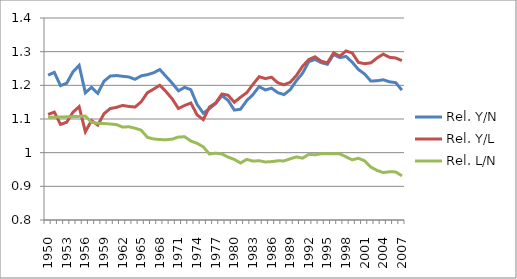
| Category | Rel. Y/N | Rel. Y/L | Rel. L/N |
|---|---|---|---|
| 1950.0 | 1.23 | 1.113 | 1.105 |
| 1951.0 | 1.239 | 1.121 | 1.105 |
| 1952.0 | 1.199 | 1.084 | 1.106 |
| 1953.0 | 1.206 | 1.09 | 1.106 |
| 1954.0 | 1.24 | 1.12 | 1.107 |
| 1955.0 | 1.259 | 1.137 | 1.108 |
| 1956.0 | 1.178 | 1.062 | 1.109 |
| 1957.0 | 1.194 | 1.095 | 1.09 |
| 1958.0 | 1.176 | 1.082 | 1.087 |
| 1959.0 | 1.212 | 1.115 | 1.087 |
| 1960.0 | 1.227 | 1.131 | 1.085 |
| 1961.0 | 1.229 | 1.134 | 1.083 |
| 1962.0 | 1.227 | 1.14 | 1.076 |
| 1963.0 | 1.225 | 1.137 | 1.077 |
| 1964.0 | 1.218 | 1.135 | 1.073 |
| 1965.0 | 1.228 | 1.151 | 1.067 |
| 1966.0 | 1.232 | 1.178 | 1.045 |
| 1967.0 | 1.237 | 1.189 | 1.041 |
| 1968.0 | 1.247 | 1.2 | 1.039 |
| 1969.0 | 1.227 | 1.181 | 1.038 |
| 1970.0 | 1.206 | 1.16 | 1.04 |
| 1971.0 | 1.184 | 1.131 | 1.047 |
| 1972.0 | 1.194 | 1.14 | 1.047 |
| 1973.0 | 1.187 | 1.147 | 1.034 |
| 1974.0 | 1.143 | 1.112 | 1.028 |
| 1975.0 | 1.117 | 1.098 | 1.017 |
| 1976.0 | 1.131 | 1.136 | 0.996 |
| 1977.0 | 1.146 | 1.147 | 0.999 |
| 1978.0 | 1.169 | 1.174 | 0.996 |
| 1979.0 | 1.155 | 1.171 | 0.987 |
| 1980.0 | 1.127 | 1.15 | 0.98 |
| 1981.0 | 1.129 | 1.165 | 0.969 |
| 1982.0 | 1.155 | 1.178 | 0.98 |
| 1983.0 | 1.173 | 1.203 | 0.975 |
| 1984.0 | 1.196 | 1.226 | 0.976 |
| 1985.0 | 1.186 | 1.22 | 0.972 |
| 1986.0 | 1.192 | 1.224 | 0.973 |
| 1987.0 | 1.178 | 1.208 | 0.976 |
| 1988.0 | 1.172 | 1.202 | 0.976 |
| 1989.0 | 1.187 | 1.209 | 0.982 |
| 1990.0 | 1.214 | 1.229 | 0.988 |
| 1991.0 | 1.236 | 1.257 | 0.984 |
| 1992.0 | 1.27 | 1.277 | 0.995 |
| 1993.0 | 1.277 | 1.285 | 0.994 |
| 1994.0 | 1.267 | 1.272 | 0.997 |
| 1995.0 | 1.262 | 1.267 | 0.997 |
| 1996.0 | 1.292 | 1.296 | 0.996 |
| 1997.0 | 1.282 | 1.287 | 0.997 |
| 1998.0 | 1.286 | 1.302 | 0.988 |
| 1999.0 | 1.269 | 1.296 | 0.979 |
| 2000.0 | 1.247 | 1.268 | 0.983 |
| 2001.0 | 1.234 | 1.264 | 0.976 |
| 2002.0 | 1.213 | 1.267 | 0.957 |
| 2003.0 | 1.214 | 1.281 | 0.947 |
| 2004.0 | 1.216 | 1.293 | 0.941 |
| 2005.0 | 1.21 | 1.283 | 0.943 |
| 2006.0 | 1.208 | 1.281 | 0.943 |
| 2007.0 | 1.186 | 1.273 | 0.931 |